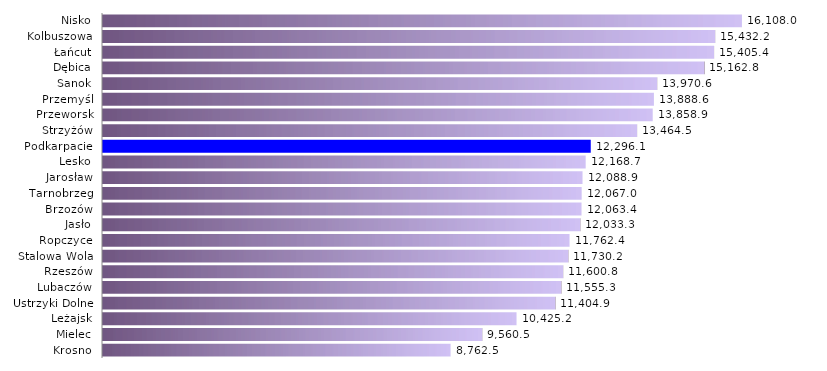
| Category | Staże |
|---|---|
| Krosno | 8762.527 |
| Mielec | 9560.501 |
| Leżajsk | 10425.221 |
| Ustrzyki Dolne | 11404.866 |
| Lubaczów | 11555.29 |
| Rzeszów | 11600.793 |
| Stalowa Wola | 11730.178 |
| Ropczyce | 11762.448 |
| Jasło | 12033.341 |
| Brzozów | 12063.406 |
| Tarnobrzeg | 12066.971 |
| Jarosław | 12088.867 |
| Lesko | 12168.748 |
| Podkarpacie | 12296.068 |
| Strzyżów | 13464.464 |
| Przeworsk | 13858.912 |
| Przemyśl | 13888.551 |
| Sanok | 13970.615 |
| Dębica | 15162.823 |
| Łańcut | 15405.388 |
| Kolbuszowa | 15432.249 |
| Nisko | 16107.976 |